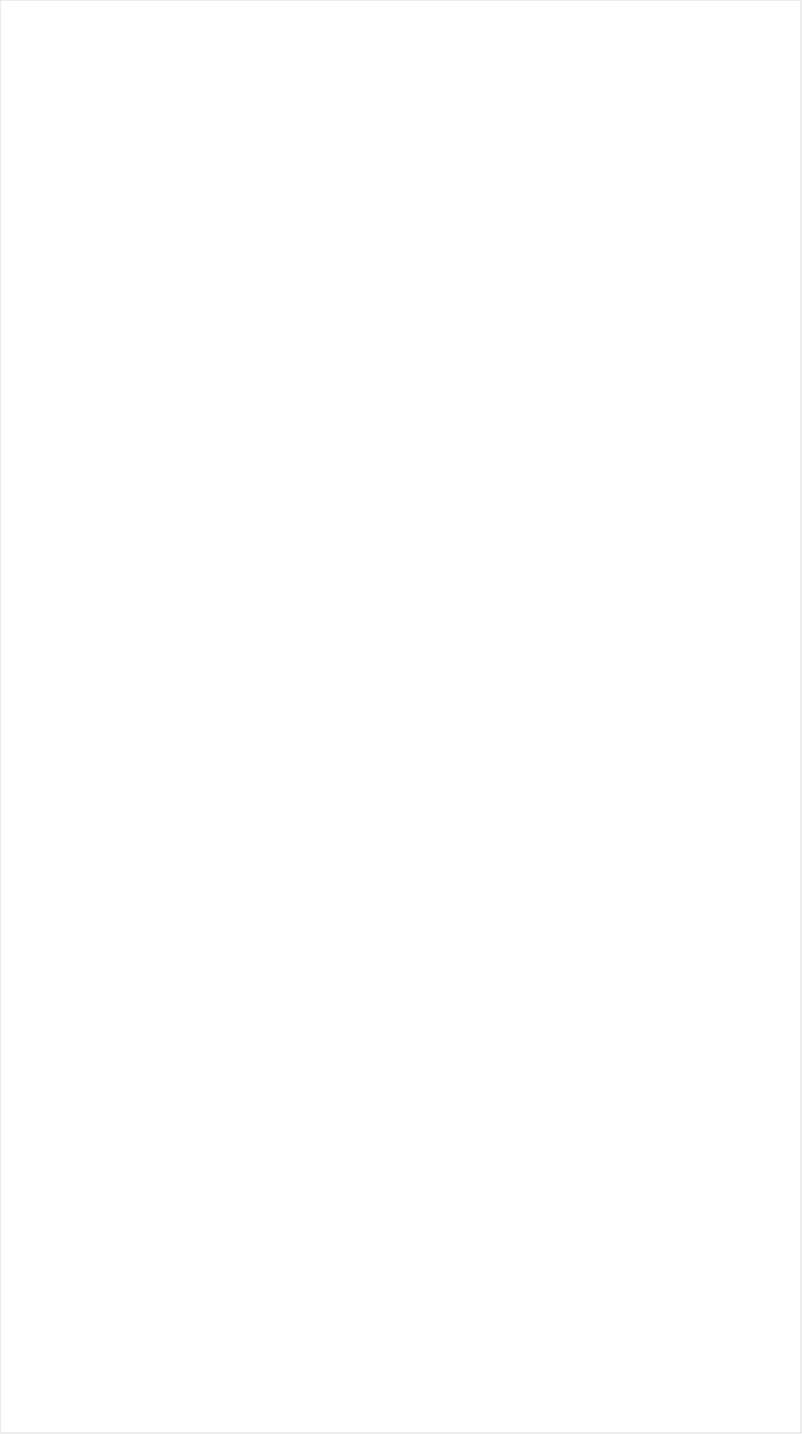
| Category | Total |
|---|---|
| Galavision | -0.903 |
| NBC Universo | -0.877 |
| UniMas | -0.869 |
| Univision | -0.864 |
| Telemundo | -0.846 |
| TUDN | -0.782 |
| TV ONE | -0.666 |
| BET | -0.653 |
| VH1 | -0.647 |
| Nick Toons | -0.626 |
| BET Her | -0.624 |
| MTV2 | -0.614 |
| Cartoon Network | -0.611 |
| Disney Channel | -0.538 |
| Lifetime Movies | -0.506 |
| Nick | -0.5 |
| Teen Nick | -0.494 |
| Adult Swim | -0.476 |
| Discovery Life Channel | -0.474 |
| Logo | -0.458 |
| Nick Jr. | -0.443 |
| Disney XD | -0.393 |
| Oprah Winfrey Network | -0.384 |
| Travel | -0.381 |
| WE TV | -0.376 |
| TLC | -0.357 |
| Investigation Discovery | -0.351 |
| Lifetime | -0.35 |
| Disney Junior US | -0.336 |
| Universal Kids | -0.316 |
| USA Network | -0.284 |
| Nick@Nite | -0.279 |
| UP TV | -0.264 |
| OXYGEN | -0.262 |
| MTV | -0.242 |
| Discovery Family Channel | -0.237 |
| FXDEP | -0.232 |
| SYFY | -0.192 |
| FXX | -0.182 |
| Hallmark | -0.167 |
| A&E | -0.165 |
| CMTV | -0.16 |
| Headline News | -0.152 |
| POP | -0.15 |
| truTV | -0.141 |
| Freeform | -0.121 |
| Hallmark Movies & Mysteries | -0.115 |
| E! | -0.101 |
| CW | -0.1 |
| ION | -0.081 |
| FX Movie Channel | -0.071 |
| INSP | -0.065 |
| TNT | -0.051 |
| FX | -0.048 |
| FOX | -0.028 |
| Great American Country | -0.022 |
| Viceland | -0.015 |
| BRAVO | 0 |
| Science Channel | 0.004 |
| Paramount Network | 0.021 |
| NBA TV | 0.021 |
| Game Show | 0.04 |
| TBS | 0.043 |
| Motor Trend Network | 0.05 |
| Comedy Central | 0.055 |
| TV LAND | 0.06 |
| Ovation | 0.066 |
| National Geographic Wild | 0.066 |
| Discovery Channel | 0.092 |
| Animal Planet | 0.092 |
| MSNBC | 0.101 |
| Reelz Channel | 0.107 |
| FYI | 0.124 |
| BBC America | 0.125 |
| Food Network | 0.126 |
| History Channel | 0.127 |
| CNN | 0.134 |
| MyNetworkTV | 0.136 |
| SundanceTV | 0.14 |
| HGTV | 0.144 |
| RFD TV | 0.151 |
| AMC | 0.161 |
| ABC | 0.175 |
| Independent Film (IFC) | 0.184 |
| WGN America | 0.197 |
| National Geographic | 0.209 |
| American Heroes Channel | 0.221 |
| Weather Channel | 0.225 |
| Cooking Channel | 0.243 |
| Destination America | 0.292 |
| ESPN Deportes | 0.363 |
| DIY | 0.365 |
| NBC | 0.397 |
| CNBC | 0.399 |
| CBS | 0.402 |
| The Sportsman Channel | 0.408 |
| Smithsonian | 0.416 |
| Fox News | 0.451 |
| PBS | 0.555 |
| NFL Network | 0.559 |
| Fox Business | 0.635 |
| Fox Sports 1 | 0.651 |
| Outdoor Channel | 0.672 |
| ESPN | 0.691 |
| NBC Sports | 0.718 |
| ESPN2 | 0.774 |
| ESPNEWS | 0.775 |
| Bloomberg HD | 0.831 |
| FOX Sports 2 | 0.878 |
| MLB Network | 1.159 |
| CBS Sports | 1.175 |
| Big Ten Network | 1.202 |
| ESPNU | 1.202 |
| PAC-12 Network | 1.206 |
| Tennis Channel | 1.286 |
| NHL | 1.423 |
| Olympic Channel | 4.49 |
| Golf | 6.151 |